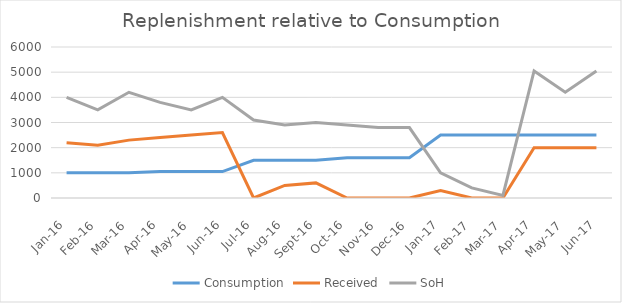
| Category | Consumption | Received | SoH |
|---|---|---|---|
| 2016-01-01 | 1000 | 2200 | 4000 |
| 2016-02-01 | 1000 | 2100 | 3500 |
| 2016-03-01 | 1000 | 2300 | 4200 |
| 2016-04-01 | 1050 | 2400 | 3800 |
| 2016-05-01 | 1050 | 2500 | 3500 |
| 2016-06-01 | 1050 | 2600 | 4000 |
| 2016-07-01 | 1500 | 0 | 3100 |
| 2016-08-01 | 1500 | 500 | 2900 |
| 2016-09-01 | 1500 | 600 | 3000 |
| 2016-10-01 | 1600 | 0 | 2900 |
| 2016-11-01 | 1600 | 0 | 2800 |
| 2016-12-01 | 1600 | 0 | 2800 |
| 2017-01-01 | 2500 | 300 | 1000 |
| 2017-02-01 | 2500 | 0 | 400 |
| 2017-03-01 | 2500 | 0 | 100 |
| 2017-04-01 | 2500 | 2000 | 5050 |
| 2017-05-01 | 2500 | 2000 | 4200 |
| 2017-06-01 | 2500 | 2000 | 5050 |